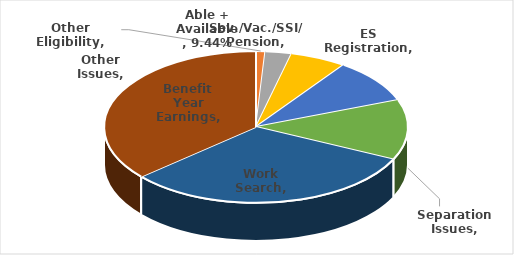
| Category | Series 0 |
|---|---|
| Sev./Vac./SSI/ Pension | 0 |
| Other Eligibility | 0.01 |
| Other Issues | 0.028 |
| ES Registration | 0.06 |
| Able + Available | 0.094 |
| Separation Issues | 0.128 |
| Work Search | 0.316 |
| Benefit Year Earnings | 0.364 |